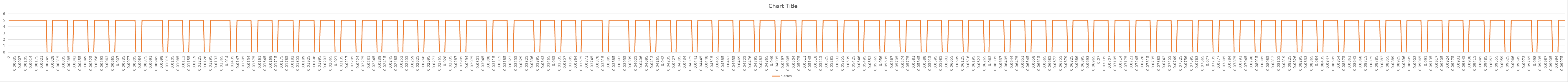
| Category | Series 1 |
|---|---|
| 0.0 | 5 |
| 5e-05 | 5 |
| 0.0001 | 5 |
| 0.00015 | 5 |
| 0.0002 | 5 |
| 0.00025 | 5 |
| 0.0003 | 5 |
| 0.00035 | 5 |
| 0.0004 | 5 |
| 0.00045 | 5 |
| 0.0005 | 5 |
| 0.00055 | 5 |
| 0.0006 | 5 |
| 0.00065 | 5 |
| 0.0007 | 5 |
| 0.00075 | 5 |
| 0.0008 | 5 |
| 0.00085 | 5 |
| 0.0009 | 5 |
| 0.00095 | 5 |
| 0.001 | 5 |
| 0.00105 | 5 |
| 0.0011 | 5 |
| 0.00115 | 5 |
| 0.0012 | 5 |
| 0.00125 | 5 |
| 0.0013 | 5 |
| 0.00135 | 5 |
| 0.0014 | 5 |
| 0.00145 | 5 |
| 0.0015 | 5 |
| 0.00155 | 5 |
| 0.0016 | 5 |
| 0.00165 | 5 |
| 0.0017 | 5 |
| 0.00175 | 5 |
| 0.0018 | 5 |
| 0.00185 | 5 |
| 0.0019 | 5 |
| 0.00195 | 5 |
| 0.002 | 5 |
| 0.00205 | 5 |
| 0.0021 | 5 |
| 0.00215 | 5 |
| 0.0022 | 5 |
| 0.00225 | 5 |
| 0.0023 | 5 |
| 0.00235 | 5 |
| 0.0024 | 5 |
| 0.00245 | 0 |
| 0.0025 | 0 |
| 0.00255 | 0 |
| 0.0026 | 0 |
| 0.00265 | 0 |
| 0.0027 | 0 |
| 0.00275 | 0 |
| 0.0028 | 5 |
| 0.00285 | 5 |
| 0.0029 | 5 |
| 0.00295 | 5 |
| 0.003 | 5 |
| 0.00305 | 5 |
| 0.0031 | 5 |
| 0.00315 | 5 |
| 0.0032 | 5 |
| 0.00325 | 5 |
| 0.0033 | 5 |
| 0.00335 | 5 |
| 0.0034 | 5 |
| 0.00345 | 5 |
| 0.0035 | 5 |
| 0.00355 | 5 |
| 0.0036 | 5 |
| 0.00365 | 5 |
| 0.0037 | 5 |
| 0.00375 | 5 |
| 0.0038 | 0 |
| 0.00385 | 0 |
| 0.0039 | 0 |
| 0.00395 | 0 |
| 0.004 | 0 |
| 0.00405 | 0 |
| 0.0041 | 0 |
| 0.00415 | 5 |
| 0.0042 | 5 |
| 0.00425 | 5 |
| 0.0043 | 5 |
| 0.00435 | 5 |
| 0.0044 | 5 |
| 0.00445 | 5 |
| 0.0045 | 5 |
| 0.00455 | 5 |
| 0.0046 | 5 |
| 0.00465 | 5 |
| 0.0047 | 5 |
| 0.00475 | 5 |
| 0.0048 | 5 |
| 0.00485 | 5 |
| 0.0049 | 5 |
| 0.00495 | 5 |
| 0.005 | 5 |
| 0.00505 | 5 |
| 0.0051 | 0 |
| 0.00515 | 0 |
| 0.0052 | 0 |
| 0.00525 | 0 |
| 0.0053 | 0 |
| 0.00535 | 0 |
| 0.0054 | 0 |
| 0.00545 | 0 |
| 0.0055 | 5 |
| 0.00555 | 5 |
| 0.0056 | 5 |
| 0.00565 | 5 |
| 0.0057 | 5 |
| 0.00575 | 5 |
| 0.0058 | 5 |
| 0.00585 | 5 |
| 0.0059 | 5 |
| 0.00595 | 5 |
| 0.006 | 5 |
| 0.00605 | 5 |
| 0.0061 | 5 |
| 0.00615 | 5 |
| 0.0062 | 5 |
| 0.00625 | 5 |
| 0.0063 | 5 |
| 0.00635 | 5 |
| 0.0064 | 5 |
| 0.00645 | 0 |
| 0.0065 | 0 |
| 0.00655 | 0 |
| 0.0066 | 0 |
| 0.00665 | 0 |
| 0.0067 | 0 |
| 0.00675 | 0 |
| 0.0068 | 0 |
| 0.00685 | 5 |
| 0.0069 | 5 |
| 0.00695 | 5 |
| 0.007 | 5 |
| 0.00705 | 5 |
| 0.0071 | 5 |
| 0.00715 | 5 |
| 0.0072 | 5 |
| 0.00725 | 5 |
| 0.0073 | 5 |
| 0.00735 | 5 |
| 0.0074 | 5 |
| 0.00745 | 5 |
| 0.0075 | 5 |
| 0.00755 | 5 |
| 0.0076 | 5 |
| 0.00765 | 5 |
| 0.0077 | 5 |
| 0.00775 | 5 |
| 0.0078 | 5 |
| 0.00785 | 5 |
| 0.0079 | 5 |
| 0.00795 | 5 |
| 0.008 | 5 |
| 0.00805 | 5 |
| 0.0081 | 5 |
| 0.00815 | 0 |
| 0.0082 | 0 |
| 0.00825 | 0 |
| 0.0083 | 0 |
| 0.00835 | 0 |
| 0.0084 | 0 |
| 0.00845 | 0 |
| 0.0085 | 0 |
| 0.00855 | 5 |
| 0.0086 | 5 |
| 0.00865 | 5 |
| 0.0087 | 5 |
| 0.00875 | 5 |
| 0.0088 | 5 |
| 0.00885 | 5 |
| 0.0089 | 5 |
| 0.00895 | 5 |
| 0.009 | 5 |
| 0.00905 | 5 |
| 0.0091 | 5 |
| 0.00915 | 5 |
| 0.0092 | 5 |
| 0.00925 | 5 |
| 0.0093 | 5 |
| 0.00935 | 5 |
| 0.0094 | 5 |
| 0.00945 | 5 |
| 0.0095 | 5 |
| 0.00955 | 5 |
| 0.0096 | 5 |
| 0.00965 | 5 |
| 0.0097 | 5 |
| 0.00975 | 5 |
| 0.0098 | 5 |
| 0.00985 | 5 |
| 0.0099 | 0 |
| 0.00995 | 0 |
| 0.01 | 0 |
| 0.01005 | 0 |
| 0.0101 | 0 |
| 0.01015 | 0 |
| 0.0102 | 0 |
| 0.01025 | 5 |
| 0.0103 | 5 |
| 0.01035 | 5 |
| 0.0104 | 5 |
| 0.01045 | 5 |
| 0.0105 | 5 |
| 0.01055 | 5 |
| 0.0106 | 5 |
| 0.01065 | 5 |
| 0.0107 | 5 |
| 0.01075 | 5 |
| 0.0108 | 5 |
| 0.01085 | 5 |
| 0.0109 | 5 |
| 0.01095 | 5 |
| 0.011 | 5 |
| 0.01105 | 5 |
| 0.0111 | 5 |
| 0.01115 | 5 |
| 0.0112 | 0 |
| 0.01125 | 0 |
| 0.0113 | 0 |
| 0.01135 | 0 |
| 0.0114 | 0 |
| 0.01145 | 0 |
| 0.0115 | 0 |
| 0.01155 | 0 |
| 0.0116 | 5 |
| 0.01165 | 5 |
| 0.0117 | 5 |
| 0.01175 | 5 |
| 0.0118 | 5 |
| 0.01185 | 5 |
| 0.0119 | 5 |
| 0.01195 | 5 |
| 0.012 | 5 |
| 0.01205 | 5 |
| 0.0121 | 5 |
| 0.01215 | 5 |
| 0.0122 | 5 |
| 0.01225 | 5 |
| 0.0123 | 5 |
| 0.01235 | 5 |
| 0.0124 | 5 |
| 0.01245 | 5 |
| 0.0125 | 5 |
| 0.01255 | 0 |
| 0.0126 | 0 |
| 0.01265 | 0 |
| 0.0127 | 0 |
| 0.01275 | 0 |
| 0.0128 | 0 |
| 0.01285 | 0 |
| 0.0129 | 0 |
| 0.01295 | 5 |
| 0.013 | 5 |
| 0.01305 | 5 |
| 0.0131 | 5 |
| 0.01315 | 5 |
| 0.0132 | 5 |
| 0.01325 | 5 |
| 0.0133 | 5 |
| 0.01335 | 5 |
| 0.0134 | 5 |
| 0.01345 | 5 |
| 0.0135 | 5 |
| 0.01355 | 5 |
| 0.0136 | 5 |
| 0.01365 | 5 |
| 0.0137 | 5 |
| 0.01375 | 5 |
| 0.0138 | 5 |
| 0.01385 | 5 |
| 0.0139 | 5 |
| 0.01395 | 5 |
| 0.014 | 5 |
| 0.01405 | 5 |
| 0.0141 | 5 |
| 0.01415 | 5 |
| 0.0142 | 5 |
| 0.01425 | 0 |
| 0.0143 | 0 |
| 0.01435 | 0 |
| 0.0144 | 0 |
| 0.01445 | 0 |
| 0.0145 | 0 |
| 0.01455 | 0 |
| 0.0146 | 0 |
| 0.01465 | 5 |
| 0.0147 | 5 |
| 0.01475 | 5 |
| 0.0148 | 5 |
| 0.01485 | 5 |
| 0.0149 | 5 |
| 0.01495 | 5 |
| 0.015 | 5 |
| 0.01505 | 5 |
| 0.0151 | 5 |
| 0.01515 | 5 |
| 0.0152 | 5 |
| 0.01525 | 5 |
| 0.0153 | 5 |
| 0.01535 | 5 |
| 0.0154 | 5 |
| 0.01545 | 5 |
| 0.0155 | 5 |
| 0.01555 | 5 |
| 0.0156 | 0 |
| 0.01565 | 0 |
| 0.0157 | 0 |
| 0.01575 | 0 |
| 0.0158 | 0 |
| 0.01585 | 0 |
| 0.0159 | 0 |
| 0.01595 | 0 |
| 0.016 | 5 |
| 0.01605 | 5 |
| 0.0161 | 5 |
| 0.01615 | 5 |
| 0.0162 | 5 |
| 0.01625 | 5 |
| 0.0163 | 5 |
| 0.01635 | 5 |
| 0.0164 | 5 |
| 0.01645 | 5 |
| 0.0165 | 5 |
| 0.01655 | 5 |
| 0.0166 | 5 |
| 0.01665 | 5 |
| 0.0167 | 5 |
| 0.01675 | 5 |
| 0.0168 | 5 |
| 0.01685 | 5 |
| 0.0169 | 5 |
| 0.01695 | 0 |
| 0.017 | 0 |
| 0.01705 | 0 |
| 0.0171 | 0 |
| 0.01715 | 0 |
| 0.0172 | 0 |
| 0.01725 | 0 |
| 0.0173 | 5 |
| 0.01735 | 5 |
| 0.0174 | 5 |
| 0.01745 | 5 |
| 0.0175 | 5 |
| 0.01755 | 5 |
| 0.0176 | 5 |
| 0.01765 | 5 |
| 0.0177 | 5 |
| 0.01775 | 5 |
| 0.0178 | 5 |
| 0.01785 | 5 |
| 0.0179 | 5 |
| 0.01795 | 5 |
| 0.018 | 5 |
| 0.01805 | 5 |
| 0.0181 | 5 |
| 0.01815 | 5 |
| 0.0182 | 5 |
| 0.01825 | 5 |
| 0.0183 | 0 |
| 0.01835 | 0 |
| 0.0184 | 0 |
| 0.01845 | 0 |
| 0.0185 | 0 |
| 0.01855 | 0 |
| 0.0186 | 0 |
| 0.01865 | 5 |
| 0.0187 | 5 |
| 0.01875 | 5 |
| 0.0188 | 5 |
| 0.01885 | 5 |
| 0.0189 | 5 |
| 0.01895 | 5 |
| 0.019 | 5 |
| 0.01905 | 5 |
| 0.0191 | 5 |
| 0.01915 | 5 |
| 0.0192 | 5 |
| 0.01925 | 5 |
| 0.0193 | 5 |
| 0.01935 | 5 |
| 0.0194 | 5 |
| 0.01945 | 5 |
| 0.0195 | 5 |
| 0.01955 | 5 |
| 0.0196 | 5 |
| 0.01965 | 0 |
| 0.0197 | 0 |
| 0.01975 | 0 |
| 0.0198 | 0 |
| 0.01985 | 0 |
| 0.0199 | 0 |
| 0.01995 | 0 |
| 0.02 | 5 |
| 0.02005 | 5 |
| 0.0201 | 5 |
| 0.02015 | 5 |
| 0.0202 | 5 |
| 0.02025 | 5 |
| 0.0203 | 5 |
| 0.02035 | 5 |
| 0.0204 | 5 |
| 0.02045 | 5 |
| 0.0205 | 5 |
| 0.02055 | 5 |
| 0.0206 | 5 |
| 0.02065 | 5 |
| 0.0207 | 5 |
| 0.02075 | 5 |
| 0.0208 | 5 |
| 0.02085 | 5 |
| 0.0209 | 5 |
| 0.02095 | 0 |
| 0.021 | 0 |
| 0.02105 | 0 |
| 0.0211 | 0 |
| 0.02115 | 0 |
| 0.0212 | 0 |
| 0.02125 | 0 |
| 0.0213 | 0 |
| 0.02135 | 5 |
| 0.0214 | 5 |
| 0.02145 | 5 |
| 0.0215 | 5 |
| 0.02155 | 5 |
| 0.0216 | 5 |
| 0.02165 | 5 |
| 0.0217 | 5 |
| 0.02175 | 5 |
| 0.0218 | 5 |
| 0.02185 | 5 |
| 0.0219 | 5 |
| 0.02195 | 5 |
| 0.022 | 5 |
| 0.02205 | 5 |
| 0.0221 | 5 |
| 0.02215 | 5 |
| 0.0222 | 5 |
| 0.02225 | 5 |
| 0.0223 | 0 |
| 0.02235 | 0 |
| 0.0224 | 0 |
| 0.02245 | 0 |
| 0.0225 | 0 |
| 0.02255 | 0 |
| 0.0226 | 0 |
| 0.02265 | 0 |
| 0.0227 | 5 |
| 0.02275 | 5 |
| 0.0228 | 5 |
| 0.02285 | 5 |
| 0.0229 | 5 |
| 0.02295 | 5 |
| 0.023 | 5 |
| 0.02305 | 5 |
| 0.0231 | 5 |
| 0.02315 | 5 |
| 0.0232 | 5 |
| 0.02325 | 5 |
| 0.0233 | 5 |
| 0.02335 | 5 |
| 0.0234 | 5 |
| 0.02345 | 5 |
| 0.0235 | 5 |
| 0.02355 | 5 |
| 0.0236 | 5 |
| 0.02365 | 0 |
| 0.0237 | 0 |
| 0.02375 | 0 |
| 0.0238 | 0 |
| 0.02385 | 0 |
| 0.0239 | 0 |
| 0.02395 | 0 |
| 0.024 | 5 |
| 0.02405 | 5 |
| 0.0241 | 5 |
| 0.02415 | 5 |
| 0.0242 | 5 |
| 0.02425 | 5 |
| 0.0243 | 5 |
| 0.02435 | 5 |
| 0.0244 | 5 |
| 0.02445 | 5 |
| 0.0245 | 5 |
| 0.02455 | 5 |
| 0.0246 | 5 |
| 0.02465 | 5 |
| 0.0247 | 5 |
| 0.02475 | 5 |
| 0.0248 | 5 |
| 0.02485 | 5 |
| 0.0249 | 5 |
| 0.02495 | 5 |
| 0.025 | 0 |
| 0.02505 | 0 |
| 0.0251 | 0 |
| 0.02515 | 0 |
| 0.0252 | 0 |
| 0.02525 | 0 |
| 0.0253 | 0 |
| 0.02535 | 5 |
| 0.0254 | 5 |
| 0.02545 | 5 |
| 0.0255 | 5 |
| 0.02555 | 5 |
| 0.0256 | 5 |
| 0.02565 | 5 |
| 0.0257 | 5 |
| 0.02575 | 5 |
| 0.0258 | 5 |
| 0.02585 | 5 |
| 0.0259 | 5 |
| 0.02595 | 5 |
| 0.026 | 5 |
| 0.02605 | 5 |
| 0.0261 | 5 |
| 0.02615 | 5 |
| 0.0262 | 5 |
| 0.02625 | 5 |
| 0.0263 | 0 |
| 0.02635 | 0 |
| 0.0264 | 0 |
| 0.02645 | 0 |
| 0.0265 | 0 |
| 0.02655 | 0 |
| 0.0266 | 0 |
| 0.02665 | 0 |
| 0.0267 | 5 |
| 0.02675 | 5 |
| 0.0268 | 5 |
| 0.02685 | 5 |
| 0.0269 | 5 |
| 0.02695 | 5 |
| 0.027 | 5 |
| 0.02705 | 5 |
| 0.0271 | 5 |
| 0.02715 | 5 |
| 0.0272 | 5 |
| 0.02725 | 5 |
| 0.0273 | 5 |
| 0.02735 | 5 |
| 0.0274 | 5 |
| 0.02745 | 5 |
| 0.0275 | 5 |
| 0.02755 | 5 |
| 0.0276 | 5 |
| 0.02765 | 0 |
| 0.0277 | 0 |
| 0.02775 | 0 |
| 0.0278 | 0 |
| 0.02785 | 0 |
| 0.0279 | 0 |
| 0.02795 | 0 |
| 0.028 | 0 |
| 0.02805 | 5 |
| 0.0281 | 5 |
| 0.02815 | 5 |
| 0.0282 | 5 |
| 0.02825 | 5 |
| 0.0283 | 5 |
| 0.02835 | 5 |
| 0.0284 | 5 |
| 0.02845 | 5 |
| 0.0285 | 5 |
| 0.02855 | 5 |
| 0.0286 | 5 |
| 0.02865 | 5 |
| 0.0287 | 5 |
| 0.02875 | 5 |
| 0.0288 | 5 |
| 0.02885 | 5 |
| 0.0289 | 5 |
| 0.02895 | 5 |
| 0.029 | 0 |
| 0.02905 | 0 |
| 0.0291 | 0 |
| 0.02915 | 0 |
| 0.0292 | 0 |
| 0.02925 | 0 |
| 0.0293 | 0 |
| 0.02935 | 0 |
| 0.0294 | 5 |
| 0.02945 | 5 |
| 0.0295 | 5 |
| 0.02955 | 5 |
| 0.0296 | 5 |
| 0.02965 | 5 |
| 0.0297 | 5 |
| 0.02975 | 5 |
| 0.0298 | 5 |
| 0.02985 | 5 |
| 0.0299 | 5 |
| 0.02995 | 5 |
| 0.03 | 5 |
| 0.03005 | 5 |
| 0.0301 | 5 |
| 0.03015 | 5 |
| 0.0302 | 5 |
| 0.03025 | 5 |
| 0.0303 | 5 |
| 0.03035 | 5 |
| 0.0304 | 5 |
| 0.03045 | 5 |
| 0.0305 | 5 |
| 0.03055 | 5 |
| 0.0306 | 5 |
| 0.03065 | 5 |
| 0.0307 | 0 |
| 0.03075 | 0 |
| 0.0308 | 0 |
| 0.03085 | 0 |
| 0.0309 | 0 |
| 0.03095 | 0 |
| 0.031 | 0 |
| 0.03105 | 0 |
| 0.0311 | 5 |
| 0.03115 | 5 |
| 0.0312 | 5 |
| 0.03125 | 5 |
| 0.0313 | 5 |
| 0.03135 | 5 |
| 0.0314 | 5 |
| 0.03145 | 5 |
| 0.0315 | 5 |
| 0.03155 | 5 |
| 0.0316 | 5 |
| 0.03165 | 5 |
| 0.0317 | 5 |
| 0.03175 | 5 |
| 0.0318 | 5 |
| 0.03185 | 5 |
| 0.0319 | 5 |
| 0.03195 | 5 |
| 0.032 | 5 |
| 0.03205 | 0 |
| 0.0321 | 0 |
| 0.03215 | 0 |
| 0.0322 | 0 |
| 0.03225 | 0 |
| 0.0323 | 0 |
| 0.03235 | 0 |
| 0.0324 | 0 |
| 0.03245 | 5 |
| 0.0325 | 5 |
| 0.03255 | 5 |
| 0.0326 | 5 |
| 0.03265 | 5 |
| 0.0327 | 5 |
| 0.03275 | 5 |
| 0.0328 | 5 |
| 0.03285 | 5 |
| 0.0329 | 5 |
| 0.03295 | 5 |
| 0.033 | 5 |
| 0.03305 | 5 |
| 0.0331 | 5 |
| 0.03315 | 5 |
| 0.0332 | 5 |
| 0.03325 | 5 |
| 0.0333 | 5 |
| 0.03335 | 5 |
| 0.0334 | 5 |
| 0.03345 | 5 |
| 0.0335 | 5 |
| 0.03355 | 5 |
| 0.0336 | 5 |
| 0.03365 | 5 |
| 0.0337 | 5 |
| 0.03375 | 0 |
| 0.0338 | 0 |
| 0.03385 | 0 |
| 0.0339 | 0 |
| 0.03395 | 0 |
| 0.034 | 0 |
| 0.03405 | 0 |
| 0.0341 | 0 |
| 0.03415 | 5 |
| 0.0342 | 5 |
| 0.03425 | 5 |
| 0.0343 | 5 |
| 0.03435 | 5 |
| 0.0344 | 5 |
| 0.03445 | 5 |
| 0.0345 | 5 |
| 0.03455 | 5 |
| 0.0346 | 5 |
| 0.03465 | 5 |
| 0.0347 | 5 |
| 0.03475 | 5 |
| 0.0348 | 5 |
| 0.03485 | 5 |
| 0.0349 | 5 |
| 0.03495 | 5 |
| 0.035 | 5 |
| 0.03505 | 5 |
| 0.0351 | 0 |
| 0.03515 | 0 |
| 0.0352 | 0 |
| 0.03525 | 0 |
| 0.0353 | 0 |
| 0.03535 | 0 |
| 0.0354 | 0 |
| 0.03545 | 0 |
| 0.0355 | 5 |
| 0.03555 | 5 |
| 0.0356 | 5 |
| 0.03565 | 5 |
| 0.0357 | 5 |
| 0.03575 | 5 |
| 0.0358 | 5 |
| 0.03585 | 5 |
| 0.0359 | 5 |
| 0.03595 | 5 |
| 0.036 | 5 |
| 0.03605 | 5 |
| 0.0361 | 5 |
| 0.03615 | 5 |
| 0.0362 | 5 |
| 0.03625 | 5 |
| 0.0363 | 5 |
| 0.03635 | 5 |
| 0.0364 | 5 |
| 0.03645 | 0 |
| 0.0365 | 0 |
| 0.03655 | 0 |
| 0.0366 | 0 |
| 0.03665 | 0 |
| 0.0367 | 0 |
| 0.03675 | 0 |
| 0.0368 | 5 |
| 0.03685 | 5 |
| 0.0369 | 5 |
| 0.03695 | 5 |
| 0.037 | 5 |
| 0.03705 | 5 |
| 0.0371 | 5 |
| 0.03715 | 5 |
| 0.0372 | 5 |
| 0.03725 | 5 |
| 0.0373 | 5 |
| 0.03735 | 5 |
| 0.0374 | 5 |
| 0.03745 | 5 |
| 0.0375 | 5 |
| 0.03755 | 5 |
| 0.0376 | 5 |
| 0.03765 | 5 |
| 0.0377 | 5 |
| 0.03775 | 5 |
| 0.0378 | 5 |
| 0.03785 | 5 |
| 0.0379 | 5 |
| 0.03795 | 5 |
| 0.038 | 5 |
| 0.03805 | 5 |
| 0.0381 | 5 |
| 0.03815 | 0 |
| 0.0382 | 0 |
| 0.03825 | 0 |
| 0.0383 | 0 |
| 0.03835 | 0 |
| 0.0384 | 0 |
| 0.03845 | 0 |
| 0.0385 | 0 |
| 0.03855 | 5 |
| 0.0386 | 5 |
| 0.03865 | 5 |
| 0.0387 | 5 |
| 0.03875 | 5 |
| 0.0388 | 5 |
| 0.03885 | 5 |
| 0.0389 | 5 |
| 0.03895 | 5 |
| 0.039 | 5 |
| 0.03905 | 5 |
| 0.0391 | 5 |
| 0.03915 | 5 |
| 0.0392 | 5 |
| 0.03925 | 5 |
| 0.0393 | 5 |
| 0.03935 | 5 |
| 0.0394 | 5 |
| 0.03945 | 5 |
| 0.0395 | 5 |
| 0.03955 | 5 |
| 0.0396 | 5 |
| 0.03965 | 5 |
| 0.0397 | 5 |
| 0.03975 | 5 |
| 0.0398 | 5 |
| 0.03985 | 0 |
| 0.0399 | 0 |
| 0.03995 | 0 |
| 0.04 | 0 |
| 0.04005 | 0 |
| 0.0401 | 0 |
| 0.04015 | 0 |
| 0.0402 | 0 |
| 0.04025 | 5 |
| 0.0403 | 5 |
| 0.04035 | 5 |
| 0.0404 | 5 |
| 0.04045 | 5 |
| 0.0405 | 5 |
| 0.04055 | 5 |
| 0.0406 | 5 |
| 0.04065 | 5 |
| 0.0407 | 5 |
| 0.04075 | 5 |
| 0.0408 | 5 |
| 0.04085 | 5 |
| 0.0409 | 5 |
| 0.04095 | 5 |
| 0.041 | 5 |
| 0.04105 | 5 |
| 0.0411 | 5 |
| 0.04115 | 5 |
| 0.0412 | 0 |
| 0.04125 | 0 |
| 0.0413 | 0 |
| 0.04135 | 0 |
| 0.0414 | 0 |
| 0.04145 | 0 |
| 0.0415 | 0 |
| 0.04155 | 0 |
| 0.0416 | 5 |
| 0.04165 | 5 |
| 0.0417 | 5 |
| 0.04175 | 5 |
| 0.0418 | 5 |
| 0.04185 | 5 |
| 0.0419 | 5 |
| 0.04195 | 5 |
| 0.042 | 5 |
| 0.04205 | 5 |
| 0.0421 | 5 |
| 0.04215 | 5 |
| 0.0422 | 5 |
| 0.04225 | 5 |
| 0.0423 | 5 |
| 0.04235 | 5 |
| 0.0424 | 5 |
| 0.04245 | 5 |
| 0.0425 | 5 |
| 0.04255 | 0 |
| 0.0426 | 0 |
| 0.04265 | 0 |
| 0.0427 | 0 |
| 0.04275 | 0 |
| 0.0428 | 0 |
| 0.04285 | 0 |
| 0.0429 | 5 |
| 0.04295 | 5 |
| 0.043 | 5 |
| 0.04305 | 5 |
| 0.0431 | 5 |
| 0.04315 | 5 |
| 0.0432 | 5 |
| 0.04325 | 5 |
| 0.0433 | 5 |
| 0.04335 | 5 |
| 0.0434 | 5 |
| 0.04345 | 5 |
| 0.0435 | 5 |
| 0.04355 | 5 |
| 0.0436 | 5 |
| 0.04365 | 5 |
| 0.0437 | 5 |
| 0.04375 | 5 |
| 0.0438 | 5 |
| 0.04385 | 5 |
| 0.0439 | 0 |
| 0.04395 | 0 |
| 0.044 | 0 |
| 0.04405 | 0 |
| 0.0441 | 0 |
| 0.04415 | 0 |
| 0.0442 | 0 |
| 0.04425 | 5 |
| 0.0443 | 5 |
| 0.04435 | 5 |
| 0.0444 | 5 |
| 0.04445 | 5 |
| 0.0445 | 5 |
| 0.04455 | 5 |
| 0.0446 | 5 |
| 0.04465 | 5 |
| 0.0447 | 5 |
| 0.04475 | 5 |
| 0.0448 | 5 |
| 0.04485 | 5 |
| 0.0449 | 5 |
| 0.04495 | 5 |
| 0.045 | 5 |
| 0.04505 | 5 |
| 0.0451 | 5 |
| 0.04515 | 5 |
| 0.0452 | 0 |
| 0.04525 | 0 |
| 0.0453 | 0 |
| 0.04535 | 0 |
| 0.0454 | 0 |
| 0.04545 | 0 |
| 0.0455 | 0 |
| 0.04555 | 0 |
| 0.0456 | 5 |
| 0.04565 | 5 |
| 0.0457 | 5 |
| 0.04575 | 5 |
| 0.0458 | 5 |
| 0.04585 | 5 |
| 0.0459 | 5 |
| 0.04595 | 5 |
| 0.046 | 5 |
| 0.04605 | 5 |
| 0.0461 | 5 |
| 0.04615 | 5 |
| 0.0462 | 5 |
| 0.04625 | 5 |
| 0.0463 | 5 |
| 0.04635 | 5 |
| 0.0464 | 5 |
| 0.04645 | 5 |
| 0.0465 | 5 |
| 0.04655 | 0 |
| 0.0466 | 0 |
| 0.04665 | 0 |
| 0.0467 | 0 |
| 0.04675 | 0 |
| 0.0468 | 0 |
| 0.04685 | 0 |
| 0.0469 | 0 |
| 0.04695 | 5 |
| 0.047 | 5 |
| 0.04705 | 5 |
| 0.0471 | 5 |
| 0.04715 | 5 |
| 0.0472 | 5 |
| 0.04725 | 5 |
| 0.0473 | 5 |
| 0.04735 | 5 |
| 0.0474 | 5 |
| 0.04745 | 5 |
| 0.0475 | 5 |
| 0.04755 | 5 |
| 0.0476 | 5 |
| 0.04765 | 5 |
| 0.0477 | 5 |
| 0.04775 | 5 |
| 0.0478 | 5 |
| 0.04785 | 5 |
| 0.0479 | 0 |
| 0.04795 | 0 |
| 0.048 | 0 |
| 0.04805 | 0 |
| 0.0481 | 0 |
| 0.04815 | 0 |
| 0.0482 | 0 |
| 0.04825 | 5 |
| 0.0483 | 5 |
| 0.04835 | 5 |
| 0.0484 | 5 |
| 0.04845 | 5 |
| 0.0485 | 5 |
| 0.04855 | 5 |
| 0.0486 | 5 |
| 0.04865 | 5 |
| 0.0487 | 5 |
| 0.04875 | 5 |
| 0.0488 | 5 |
| 0.04885 | 5 |
| 0.0489 | 5 |
| 0.04895 | 5 |
| 0.049 | 5 |
| 0.04905 | 5 |
| 0.0491 | 5 |
| 0.04915 | 5 |
| 0.0492 | 5 |
| 0.04925 | 0 |
| 0.0493 | 0 |
| 0.04935 | 0 |
| 0.0494 | 0 |
| 0.04945 | 0 |
| 0.0495 | 0 |
| 0.04955 | 0 |
| 0.0496 | 5 |
| 0.04965 | 5 |
| 0.0497 | 5 |
| 0.04975 | 5 |
| 0.0498 | 5 |
| 0.04985 | 5 |
| 0.0499 | 5 |
| 0.04995 | 5 |
| 0.05 | 5 |
| 0.05005 | 5 |
| 0.0501 | 5 |
| 0.05015 | 5 |
| 0.0502 | 5 |
| 0.05025 | 5 |
| 0.0503 | 5 |
| 0.05035 | 5 |
| 0.0504 | 5 |
| 0.05045 | 5 |
| 0.0505 | 5 |
| 0.05055 | 5 |
| 0.0506 | 0 |
| 0.05065 | 0 |
| 0.0507 | 0 |
| 0.05075 | 0 |
| 0.0508 | 0 |
| 0.05085 | 0 |
| 0.0509 | 0 |
| 0.05095 | 5 |
| 0.051 | 5 |
| 0.05105 | 5 |
| 0.0511 | 5 |
| 0.05115 | 5 |
| 0.0512 | 5 |
| 0.05125 | 5 |
| 0.0513 | 5 |
| 0.05135 | 5 |
| 0.0514 | 5 |
| 0.05145 | 5 |
| 0.0515 | 5 |
| 0.05155 | 5 |
| 0.0516 | 5 |
| 0.05165 | 5 |
| 0.0517 | 5 |
| 0.05175 | 5 |
| 0.0518 | 5 |
| 0.05185 | 5 |
| 0.0519 | 0 |
| 0.05195 | 0 |
| 0.052 | 0 |
| 0.05205 | 0 |
| 0.0521 | 0 |
| 0.05215 | 0 |
| 0.0522 | 0 |
| 0.05225 | 0 |
| 0.0523 | 5 |
| 0.05235 | 5 |
| 0.0524 | 5 |
| 0.05245 | 5 |
| 0.0525 | 5 |
| 0.05255 | 5 |
| 0.0526 | 5 |
| 0.05265 | 5 |
| 0.0527 | 5 |
| 0.05275 | 5 |
| 0.0528 | 5 |
| 0.05285 | 5 |
| 0.0529 | 5 |
| 0.05295 | 5 |
| 0.053 | 5 |
| 0.05305 | 5 |
| 0.0531 | 5 |
| 0.05315 | 5 |
| 0.0532 | 5 |
| 0.05325 | 0 |
| 0.0533 | 0 |
| 0.05335 | 0 |
| 0.0534 | 0 |
| 0.05345 | 0 |
| 0.0535 | 0 |
| 0.05355 | 0 |
| 0.0536 | 0 |
| 0.05365 | 5 |
| 0.0537 | 5 |
| 0.05375 | 5 |
| 0.0538 | 5 |
| 0.05385 | 5 |
| 0.0539 | 5 |
| 0.05395 | 5 |
| 0.054 | 5 |
| 0.05405 | 5 |
| 0.0541 | 5 |
| 0.05415 | 5 |
| 0.0542 | 5 |
| 0.05425 | 5 |
| 0.0543 | 5 |
| 0.05435 | 5 |
| 0.0544 | 5 |
| 0.05445 | 5 |
| 0.0545 | 5 |
| 0.05455 | 5 |
| 0.0546 | 0 |
| 0.05465 | 0 |
| 0.0547 | 0 |
| 0.05475 | 0 |
| 0.0548 | 0 |
| 0.05485 | 0 |
| 0.0549 | 0 |
| 0.05495 | 5 |
| 0.055 | 5 |
| 0.05505 | 5 |
| 0.0551 | 5 |
| 0.05515 | 5 |
| 0.0552 | 5 |
| 0.05525 | 5 |
| 0.0553 | 5 |
| 0.05535 | 5 |
| 0.0554 | 5 |
| 0.05545 | 5 |
| 0.0555 | 5 |
| 0.05555 | 5 |
| 0.0556 | 5 |
| 0.05565 | 5 |
| 0.0557 | 5 |
| 0.05575 | 5 |
| 0.0558 | 5 |
| 0.05585 | 5 |
| 0.0559 | 5 |
| 0.05595 | 0 |
| 0.056 | 0 |
| 0.05605 | 0 |
| 0.0561 | 0 |
| 0.05615 | 0 |
| 0.0562 | 0 |
| 0.05625 | 0 |
| 0.0563 | 5 |
| 0.05635 | 5 |
| 0.0564 | 5 |
| 0.05645 | 5 |
| 0.0565 | 5 |
| 0.05655 | 5 |
| 0.0566 | 5 |
| 0.05665 | 5 |
| 0.0567 | 5 |
| 0.05675 | 5 |
| 0.0568 | 5 |
| 0.05685 | 5 |
| 0.0569 | 5 |
| 0.05695 | 5 |
| 0.057 | 5 |
| 0.05705 | 5 |
| 0.0571 | 5 |
| 0.05715 | 5 |
| 0.0572 | 5 |
| 0.05725 | 0 |
| 0.0573 | 0 |
| 0.05735 | 0 |
| 0.0574 | 0 |
| 0.05745 | 0 |
| 0.0575 | 0 |
| 0.05755 | 0 |
| 0.0576 | 0 |
| 0.05765 | 5 |
| 0.0577 | 5 |
| 0.05775 | 5 |
| 0.0578 | 5 |
| 0.05785 | 5 |
| 0.0579 | 5 |
| 0.05795 | 5 |
| 0.058 | 5 |
| 0.05805 | 5 |
| 0.0581 | 5 |
| 0.05815 | 5 |
| 0.0582 | 5 |
| 0.05825 | 5 |
| 0.0583 | 5 |
| 0.05835 | 5 |
| 0.0584 | 5 |
| 0.05845 | 5 |
| 0.0585 | 5 |
| 0.05855 | 5 |
| 0.0586 | 0 |
| 0.05865 | 0 |
| 0.0587 | 0 |
| 0.05875 | 0 |
| 0.0588 | 0 |
| 0.05885 | 0 |
| 0.0589 | 0 |
| 0.05895 | 0 |
| 0.059 | 5 |
| 0.05905 | 5 |
| 0.0591 | 5 |
| 0.05915 | 5 |
| 0.0592 | 5 |
| 0.05925 | 5 |
| 0.0593 | 5 |
| 0.05935 | 5 |
| 0.0594 | 5 |
| 0.05945 | 5 |
| 0.0595 | 5 |
| 0.05955 | 5 |
| 0.0596 | 5 |
| 0.05965 | 5 |
| 0.0597 | 5 |
| 0.05975 | 5 |
| 0.0598 | 5 |
| 0.05985 | 5 |
| 0.0599 | 5 |
| 0.05995 | 0 |
| 0.06 | 0 |
| 0.06005 | 0 |
| 0.0601 | 0 |
| 0.06015 | 0 |
| 0.0602 | 0 |
| 0.06025 | 0 |
| 0.0603 | 0 |
| 0.06035 | 5 |
| 0.0604 | 5 |
| 0.06045 | 5 |
| 0.0605 | 5 |
| 0.06055 | 5 |
| 0.0606 | 5 |
| 0.06065 | 5 |
| 0.0607 | 5 |
| 0.06075 | 5 |
| 0.0608 | 5 |
| 0.06085 | 5 |
| 0.0609 | 5 |
| 0.06095 | 5 |
| 0.061 | 5 |
| 0.06105 | 5 |
| 0.0611 | 5 |
| 0.06115 | 5 |
| 0.0612 | 5 |
| 0.06125 | 5 |
| 0.0613 | 0 |
| 0.06135 | 0 |
| 0.0614 | 0 |
| 0.06145 | 0 |
| 0.0615 | 0 |
| 0.06155 | 0 |
| 0.0616 | 0 |
| 0.06165 | 5 |
| 0.0617 | 5 |
| 0.06175 | 5 |
| 0.0618 | 5 |
| 0.06185 | 5 |
| 0.0619 | 5 |
| 0.06195 | 5 |
| 0.062 | 5 |
| 0.06205 | 5 |
| 0.0621 | 5 |
| 0.06215 | 5 |
| 0.0622 | 5 |
| 0.06225 | 5 |
| 0.0623 | 5 |
| 0.06235 | 5 |
| 0.0624 | 5 |
| 0.06245 | 5 |
| 0.0625 | 5 |
| 0.06255 | 5 |
| 0.0626 | 5 |
| 0.06265 | 0 |
| 0.0627 | 0 |
| 0.06275 | 0 |
| 0.0628 | 0 |
| 0.06285 | 0 |
| 0.0629 | 0 |
| 0.06295 | 0 |
| 0.063 | 5 |
| 0.06305 | 5 |
| 0.0631 | 5 |
| 0.06315 | 5 |
| 0.0632 | 5 |
| 0.06325 | 5 |
| 0.0633 | 5 |
| 0.06335 | 5 |
| 0.0634 | 5 |
| 0.06345 | 5 |
| 0.0635 | 5 |
| 0.06355 | 5 |
| 0.0636 | 5 |
| 0.06365 | 5 |
| 0.0637 | 5 |
| 0.06375 | 5 |
| 0.0638 | 5 |
| 0.06385 | 5 |
| 0.0639 | 5 |
| 0.06395 | 0 |
| 0.064 | 0 |
| 0.06405 | 0 |
| 0.0641 | 0 |
| 0.06415 | 0 |
| 0.0642 | 0 |
| 0.06425 | 0 |
| 0.0643 | 0 |
| 0.06435 | 5 |
| 0.0644 | 5 |
| 0.06445 | 5 |
| 0.0645 | 5 |
| 0.06455 | 5 |
| 0.0646 | 5 |
| 0.06465 | 5 |
| 0.0647 | 5 |
| 0.06475 | 5 |
| 0.0648 | 5 |
| 0.06485 | 5 |
| 0.0649 | 5 |
| 0.06495 | 5 |
| 0.065 | 5 |
| 0.06505 | 5 |
| 0.0651 | 5 |
| 0.06515 | 5 |
| 0.0652 | 5 |
| 0.06525 | 5 |
| 0.0653 | 0 |
| 0.06535 | 0 |
| 0.0654 | 0 |
| 0.06545 | 0 |
| 0.0655 | 0 |
| 0.06555 | 0 |
| 0.0656 | 0 |
| 0.06565 | 0 |
| 0.0657 | 5 |
| 0.06575 | 5 |
| 0.0658 | 5 |
| 0.06585 | 5 |
| 0.0659 | 5 |
| 0.06595 | 5 |
| 0.066 | 5 |
| 0.06605 | 5 |
| 0.0661 | 5 |
| 0.06615 | 5 |
| 0.0662 | 5 |
| 0.06625 | 5 |
| 0.0663 | 5 |
| 0.06635 | 5 |
| 0.0664 | 5 |
| 0.06645 | 5 |
| 0.0665 | 5 |
| 0.06655 | 5 |
| 0.0666 | 5 |
| 0.06665 | 0 |
| 0.0667 | 0 |
| 0.06675 | 0 |
| 0.0668 | 0 |
| 0.06685 | 0 |
| 0.0669 | 0 |
| 0.06695 | 0 |
| 0.067 | 0 |
| 0.06705 | 5 |
| 0.0671 | 5 |
| 0.06715 | 5 |
| 0.0672 | 5 |
| 0.06725 | 5 |
| 0.0673 | 5 |
| 0.06735 | 5 |
| 0.0674 | 5 |
| 0.06745 | 5 |
| 0.0675 | 5 |
| 0.06755 | 5 |
| 0.0676 | 5 |
| 0.06765 | 5 |
| 0.0677 | 5 |
| 0.06775 | 5 |
| 0.0678 | 5 |
| 0.06785 | 5 |
| 0.0679 | 5 |
| 0.06795 | 5 |
| 0.068 | 0 |
| 0.06805 | 0 |
| 0.0681 | 0 |
| 0.06815 | 0 |
| 0.0682 | 0 |
| 0.06825 | 0 |
| 0.0683 | 0 |
| 0.06835 | 5 |
| 0.0684 | 5 |
| 0.06845 | 5 |
| 0.0685 | 5 |
| 0.06855 | 5 |
| 0.0686 | 5 |
| 0.06865 | 5 |
| 0.0687 | 5 |
| 0.06875 | 5 |
| 0.0688 | 5 |
| 0.06885 | 5 |
| 0.0689 | 5 |
| 0.06895 | 5 |
| 0.069 | 5 |
| 0.06905 | 5 |
| 0.0691 | 5 |
| 0.06915 | 5 |
| 0.0692 | 5 |
| 0.06925 | 5 |
| 0.0693 | 5 |
| 0.06935 | 0 |
| 0.0694 | 0 |
| 0.06945 | 0 |
| 0.0695 | 0 |
| 0.06955 | 0 |
| 0.0696 | 0 |
| 0.06965 | 0 |
| 0.0697 | 5 |
| 0.06975 | 5 |
| 0.0698 | 5 |
| 0.06985 | 5 |
| 0.0699 | 5 |
| 0.06995 | 5 |
| 0.07 | 5 |
| 0.07005 | 5 |
| 0.0701 | 5 |
| 0.07015 | 5 |
| 0.0702 | 5 |
| 0.07025 | 5 |
| 0.0703 | 5 |
| 0.07035 | 5 |
| 0.0704 | 5 |
| 0.07045 | 5 |
| 0.0705 | 5 |
| 0.07055 | 5 |
| 0.0706 | 5 |
| 0.07065 | 0 |
| 0.0707 | 0 |
| 0.07075 | 0 |
| 0.0708 | 0 |
| 0.07085 | 0 |
| 0.0709 | 0 |
| 0.07095 | 0 |
| 0.071 | 0 |
| 0.07105 | 5 |
| 0.0711 | 5 |
| 0.07115 | 5 |
| 0.0712 | 5 |
| 0.07125 | 5 |
| 0.0713 | 5 |
| 0.07135 | 5 |
| 0.0714 | 5 |
| 0.07145 | 5 |
| 0.0715 | 5 |
| 0.07155 | 5 |
| 0.0716 | 5 |
| 0.07165 | 5 |
| 0.0717 | 5 |
| 0.07175 | 5 |
| 0.0718 | 5 |
| 0.07185 | 5 |
| 0.0719 | 5 |
| 0.07195 | 5 |
| 0.072 | 0 |
| 0.07205 | 0 |
| 0.0721 | 0 |
| 0.07215 | 0 |
| 0.0722 | 0 |
| 0.07225 | 0 |
| 0.0723 | 0 |
| 0.07235 | 0 |
| 0.0724 | 5 |
| 0.07245 | 5 |
| 0.0725 | 5 |
| 0.07255 | 5 |
| 0.0726 | 5 |
| 0.07265 | 5 |
| 0.0727 | 5 |
| 0.07275 | 5 |
| 0.0728 | 5 |
| 0.07285 | 5 |
| 0.0729 | 5 |
| 0.07295 | 5 |
| 0.073 | 5 |
| 0.07305 | 5 |
| 0.0731 | 5 |
| 0.07315 | 5 |
| 0.0732 | 5 |
| 0.07325 | 5 |
| 0.0733 | 5 |
| 0.07335 | 0 |
| 0.0734 | 0 |
| 0.07345 | 0 |
| 0.0735 | 0 |
| 0.07355 | 0 |
| 0.0736 | 0 |
| 0.07365 | 0 |
| 0.0737 | 0 |
| 0.07375 | 5 |
| 0.0738 | 5 |
| 0.07385 | 5 |
| 0.0739 | 5 |
| 0.07395 | 5 |
| 0.074 | 5 |
| 0.07405 | 5 |
| 0.0741 | 5 |
| 0.07415 | 5 |
| 0.0742 | 5 |
| 0.07425 | 5 |
| 0.0743 | 5 |
| 0.07435 | 5 |
| 0.0744 | 5 |
| 0.07445 | 5 |
| 0.0745 | 5 |
| 0.07455 | 5 |
| 0.0746 | 5 |
| 0.07465 | 5 |
| 0.0747 | 0 |
| 0.07475 | 0 |
| 0.0748 | 0 |
| 0.07485 | 0 |
| 0.0749 | 0 |
| 0.07495 | 0 |
| 0.075 | 0 |
| 0.07505 | 5 |
| 0.0751 | 5 |
| 0.07515 | 5 |
| 0.0752 | 5 |
| 0.07525 | 5 |
| 0.0753 | 5 |
| 0.07535 | 5 |
| 0.0754 | 5 |
| 0.07545 | 5 |
| 0.0755 | 5 |
| 0.07555 | 5 |
| 0.0756 | 5 |
| 0.07565 | 5 |
| 0.0757 | 5 |
| 0.07575 | 5 |
| 0.0758 | 5 |
| 0.07585 | 5 |
| 0.0759 | 5 |
| 0.07595 | 5 |
| 0.076 | 5 |
| 0.07605 | 0 |
| 0.0761 | 0 |
| 0.07615 | 0 |
| 0.0762 | 0 |
| 0.07625 | 0 |
| 0.0763 | 0 |
| 0.07635 | 0 |
| 0.0764 | 5 |
| 0.07645 | 5 |
| 0.0765 | 5 |
| 0.07655 | 5 |
| 0.0766 | 5 |
| 0.07665 | 5 |
| 0.0767 | 5 |
| 0.07675 | 5 |
| 0.0768 | 5 |
| 0.07685 | 5 |
| 0.0769 | 5 |
| 0.07695 | 5 |
| 0.077 | 5 |
| 0.07705 | 5 |
| 0.0771 | 5 |
| 0.07715 | 5 |
| 0.0772 | 5 |
| 0.07725 | 5 |
| 0.0773 | 5 |
| 0.07735 | 0 |
| 0.0774 | 0 |
| 0.07745 | 0 |
| 0.0775 | 0 |
| 0.07755 | 0 |
| 0.0776 | 0 |
| 0.07765 | 0 |
| 0.0777 | 0 |
| 0.07775 | 5 |
| 0.0778 | 5 |
| 0.07785 | 5 |
| 0.0779 | 5 |
| 0.07795 | 5 |
| 0.078 | 5 |
| 0.07805 | 5 |
| 0.0781 | 5 |
| 0.07815 | 5 |
| 0.0782 | 5 |
| 0.07825 | 5 |
| 0.0783 | 5 |
| 0.07835 | 5 |
| 0.0784 | 5 |
| 0.07845 | 5 |
| 0.0785 | 5 |
| 0.07855 | 5 |
| 0.0786 | 5 |
| 0.07865 | 5 |
| 0.0787 | 0 |
| 0.07875 | 0 |
| 0.0788 | 0 |
| 0.07885 | 0 |
| 0.0789 | 0 |
| 0.07895 | 0 |
| 0.079 | 0 |
| 0.07905 | 0 |
| 0.0791 | 5 |
| 0.07915 | 5 |
| 0.0792 | 5 |
| 0.07925 | 5 |
| 0.0793 | 5 |
| 0.07935 | 5 |
| 0.0794 | 5 |
| 0.07945 | 5 |
| 0.0795 | 5 |
| 0.07955 | 5 |
| 0.0796 | 5 |
| 0.07965 | 5 |
| 0.0797 | 5 |
| 0.07975 | 5 |
| 0.0798 | 5 |
| 0.07985 | 5 |
| 0.0799 | 5 |
| 0.07995 | 5 |
| 0.08 | 5 |
| 0.08005 | 0 |
| 0.0801 | 0 |
| 0.08015 | 0 |
| 0.0802 | 0 |
| 0.08025 | 0 |
| 0.0803 | 0 |
| 0.08035 | 0 |
| 0.0804 | 0 |
| 0.08045 | 5 |
| 0.0805 | 5 |
| 0.08055 | 5 |
| 0.0806 | 5 |
| 0.08065 | 5 |
| 0.0807 | 5 |
| 0.08075 | 5 |
| 0.0808 | 5 |
| 0.08085 | 5 |
| 0.0809 | 5 |
| 0.08095 | 5 |
| 0.081 | 5 |
| 0.08105 | 5 |
| 0.0811 | 5 |
| 0.08115 | 5 |
| 0.0812 | 5 |
| 0.08125 | 5 |
| 0.0813 | 5 |
| 0.08135 | 5 |
| 0.0814 | 0 |
| 0.08145 | 0 |
| 0.0815 | 0 |
| 0.08155 | 0 |
| 0.0816 | 0 |
| 0.08165 | 0 |
| 0.0817 | 0 |
| 0.08175 | 5 |
| 0.0818 | 5 |
| 0.08185 | 5 |
| 0.0819 | 5 |
| 0.08195 | 5 |
| 0.082 | 5 |
| 0.08205 | 5 |
| 0.0821 | 5 |
| 0.08215 | 5 |
| 0.0822 | 5 |
| 0.08225 | 5 |
| 0.0823 | 5 |
| 0.08235 | 5 |
| 0.0824 | 5 |
| 0.08245 | 5 |
| 0.0825 | 5 |
| 0.08255 | 5 |
| 0.0826 | 5 |
| 0.08265 | 5 |
| 0.0827 | 5 |
| 0.08275 | 0 |
| 0.0828 | 0 |
| 0.08285 | 0 |
| 0.0829 | 0 |
| 0.08295 | 0 |
| 0.083 | 0 |
| 0.08305 | 0 |
| 0.0831 | 5 |
| 0.08315 | 5 |
| 0.0832 | 5 |
| 0.08325 | 5 |
| 0.0833 | 5 |
| 0.08335 | 5 |
| 0.0834 | 5 |
| 0.08345 | 5 |
| 0.0835 | 5 |
| 0.08355 | 5 |
| 0.0836 | 5 |
| 0.08365 | 5 |
| 0.0837 | 5 |
| 0.08375 | 5 |
| 0.0838 | 5 |
| 0.08385 | 5 |
| 0.0839 | 5 |
| 0.08395 | 5 |
| 0.084 | 5 |
| 0.08405 | 0 |
| 0.0841 | 0 |
| 0.08415 | 0 |
| 0.0842 | 0 |
| 0.08425 | 0 |
| 0.0843 | 0 |
| 0.08435 | 0 |
| 0.0844 | 0 |
| 0.08445 | 5 |
| 0.0845 | 5 |
| 0.08455 | 5 |
| 0.0846 | 5 |
| 0.08465 | 5 |
| 0.0847 | 5 |
| 0.08475 | 5 |
| 0.0848 | 5 |
| 0.08485 | 5 |
| 0.0849 | 5 |
| 0.08495 | 5 |
| 0.085 | 5 |
| 0.08505 | 5 |
| 0.0851 | 5 |
| 0.08515 | 5 |
| 0.0852 | 5 |
| 0.08525 | 5 |
| 0.0853 | 5 |
| 0.08535 | 5 |
| 0.0854 | 0 |
| 0.08545 | 0 |
| 0.0855 | 0 |
| 0.08555 | 0 |
| 0.0856 | 0 |
| 0.08565 | 0 |
| 0.0857 | 0 |
| 0.08575 | 0 |
| 0.0858 | 5 |
| 0.08585 | 5 |
| 0.0859 | 5 |
| 0.08595 | 5 |
| 0.086 | 5 |
| 0.08605 | 5 |
| 0.0861 | 5 |
| 0.08615 | 5 |
| 0.0862 | 5 |
| 0.08625 | 5 |
| 0.0863 | 5 |
| 0.08635 | 5 |
| 0.0864 | 5 |
| 0.08645 | 5 |
| 0.0865 | 5 |
| 0.08655 | 5 |
| 0.0866 | 5 |
| 0.08665 | 5 |
| 0.0867 | 5 |
| 0.08675 | 0 |
| 0.0868 | 0 |
| 0.08685 | 0 |
| 0.0869 | 0 |
| 0.08695 | 0 |
| 0.087 | 0 |
| 0.08705 | 0 |
| 0.0871 | 5 |
| 0.08715 | 5 |
| 0.0872 | 5 |
| 0.08725 | 5 |
| 0.0873 | 5 |
| 0.08735 | 5 |
| 0.0874 | 5 |
| 0.08745 | 5 |
| 0.0875 | 5 |
| 0.08755 | 5 |
| 0.0876 | 5 |
| 0.08765 | 5 |
| 0.0877 | 5 |
| 0.08775 | 5 |
| 0.0878 | 5 |
| 0.08785 | 5 |
| 0.0879 | 5 |
| 0.08795 | 5 |
| 0.088 | 5 |
| 0.08805 | 5 |
| 0.0881 | 0 |
| 0.08815 | 0 |
| 0.0882 | 0 |
| 0.08825 | 0 |
| 0.0883 | 0 |
| 0.08835 | 0 |
| 0.0884 | 0 |
| 0.08845 | 5 |
| 0.0885 | 5 |
| 0.08855 | 5 |
| 0.0886 | 5 |
| 0.08865 | 5 |
| 0.0887 | 5 |
| 0.08875 | 5 |
| 0.0888 | 5 |
| 0.08885 | 5 |
| 0.0889 | 5 |
| 0.08895 | 5 |
| 0.089 | 5 |
| 0.08905 | 5 |
| 0.0891 | 5 |
| 0.08915 | 5 |
| 0.0892 | 5 |
| 0.08925 | 5 |
| 0.0893 | 5 |
| 0.08935 | 5 |
| 0.0894 | 5 |
| 0.08945 | 0 |
| 0.0895 | 0 |
| 0.08955 | 0 |
| 0.0896 | 0 |
| 0.08965 | 0 |
| 0.0897 | 0 |
| 0.08975 | 0 |
| 0.0898 | 5 |
| 0.08985 | 5 |
| 0.0899 | 5 |
| 0.08995 | 5 |
| 0.09 | 5 |
| 0.09005 | 5 |
| 0.0901 | 5 |
| 0.09015 | 5 |
| 0.0902 | 5 |
| 0.09025 | 5 |
| 0.0903 | 5 |
| 0.09035 | 5 |
| 0.0904 | 5 |
| 0.09045 | 5 |
| 0.0905 | 5 |
| 0.09055 | 5 |
| 0.0906 | 5 |
| 0.09065 | 5 |
| 0.0907 | 5 |
| 0.09075 | 0 |
| 0.0908 | 0 |
| 0.09085 | 0 |
| 0.0909 | 0 |
| 0.09095 | 0 |
| 0.091 | 0 |
| 0.09105 | 0 |
| 0.0911 | 0 |
| 0.09115 | 5 |
| 0.0912 | 5 |
| 0.09125 | 5 |
| 0.0913 | 5 |
| 0.09135 | 5 |
| 0.0914 | 5 |
| 0.09145 | 5 |
| 0.0915 | 5 |
| 0.09155 | 5 |
| 0.0916 | 5 |
| 0.09165 | 5 |
| 0.0917 | 5 |
| 0.09175 | 5 |
| 0.0918 | 5 |
| 0.09185 | 5 |
| 0.0919 | 5 |
| 0.09195 | 5 |
| 0.092 | 5 |
| 0.09205 | 5 |
| 0.0921 | 0 |
| 0.09215 | 0 |
| 0.0922 | 0 |
| 0.09225 | 0 |
| 0.0923 | 0 |
| 0.09235 | 0 |
| 0.0924 | 0 |
| 0.09245 | 0 |
| 0.0925 | 5 |
| 0.09255 | 5 |
| 0.0926 | 5 |
| 0.09265 | 5 |
| 0.0927 | 5 |
| 0.09275 | 5 |
| 0.0928 | 5 |
| 0.09285 | 5 |
| 0.0929 | 5 |
| 0.09295 | 5 |
| 0.093 | 5 |
| 0.09305 | 5 |
| 0.0931 | 5 |
| 0.09315 | 5 |
| 0.0932 | 5 |
| 0.09325 | 5 |
| 0.0933 | 5 |
| 0.09335 | 5 |
| 0.0934 | 5 |
| 0.09345 | 0 |
| 0.0935 | 0 |
| 0.09355 | 0 |
| 0.0936 | 0 |
| 0.09365 | 0 |
| 0.0937 | 0 |
| 0.09375 | 0 |
| 0.0938 | 5 |
| 0.09385 | 5 |
| 0.0939 | 5 |
| 0.09395 | 5 |
| 0.094 | 5 |
| 0.09405 | 5 |
| 0.0941 | 5 |
| 0.09415 | 5 |
| 0.0942 | 5 |
| 0.09425 | 5 |
| 0.0943 | 5 |
| 0.09435 | 5 |
| 0.0944 | 5 |
| 0.09445 | 5 |
| 0.0945 | 5 |
| 0.09455 | 5 |
| 0.0946 | 5 |
| 0.09465 | 5 |
| 0.0947 | 5 |
| 0.09475 | 5 |
| 0.0948 | 0 |
| 0.09485 | 0 |
| 0.0949 | 0 |
| 0.09495 | 0 |
| 0.095 | 0 |
| 0.09505 | 0 |
| 0.0951 | 0 |
| 0.09515 | 5 |
| 0.0952 | 5 |
| 0.09525 | 5 |
| 0.0953 | 5 |
| 0.09535 | 5 |
| 0.0954 | 5 |
| 0.09545 | 5 |
| 0.0955 | 5 |
| 0.09555 | 5 |
| 0.0956 | 5 |
| 0.09565 | 5 |
| 0.0957 | 5 |
| 0.09575 | 5 |
| 0.0958 | 5 |
| 0.09585 | 5 |
| 0.0959 | 5 |
| 0.09595 | 5 |
| 0.096 | 5 |
| 0.09605 | 5 |
| 0.0961 | 0 |
| 0.09615 | 0 |
| 0.0962 | 0 |
| 0.09625 | 0 |
| 0.0963 | 0 |
| 0.09635 | 0 |
| 0.0964 | 0 |
| 0.09645 | 0 |
| 0.0965 | 5 |
| 0.09655 | 5 |
| 0.0966 | 5 |
| 0.09665 | 5 |
| 0.0967 | 5 |
| 0.09675 | 5 |
| 0.0968 | 5 |
| 0.09685 | 5 |
| 0.0969 | 5 |
| 0.09695 | 5 |
| 0.097 | 5 |
| 0.09705 | 5 |
| 0.0971 | 5 |
| 0.09715 | 5 |
| 0.0972 | 5 |
| 0.09725 | 5 |
| 0.0973 | 5 |
| 0.09735 | 5 |
| 0.0974 | 5 |
| 0.09745 | 5 |
| 0.0975 | 5 |
| 0.09755 | 5 |
| 0.0976 | 5 |
| 0.09765 | 5 |
| 0.0977 | 5 |
| 0.09775 | 5 |
| 0.0978 | 5 |
| 0.09785 | 0 |
| 0.0979 | 0 |
| 0.09795 | 0 |
| 0.098 | 0 |
| 0.09805 | 0 |
| 0.0981 | 0 |
| 0.09815 | 0 |
| 0.0982 | 5 |
| 0.09825 | 5 |
| 0.0983 | 5 |
| 0.09835 | 5 |
| 0.0984 | 5 |
| 0.09845 | 5 |
| 0.0985 | 5 |
| 0.09855 | 5 |
| 0.0986 | 5 |
| 0.09865 | 5 |
| 0.0987 | 5 |
| 0.09875 | 5 |
| 0.0988 | 5 |
| 0.09885 | 5 |
| 0.0989 | 5 |
| 0.09895 | 5 |
| 0.099 | 5 |
| 0.09905 | 5 |
| 0.0991 | 5 |
| 0.09915 | 0 |
| 0.0992 | 0 |
| 0.09925 | 0 |
| 0.0993 | 0 |
| 0.09935 | 0 |
| 0.0994 | 0 |
| 0.09945 | 0 |
| 0.0995 | 0 |
| 0.09955 | 5 |
| 0.0996 | 5 |
| 0.09965 | 5 |
| 0.0997 | 5 |
| 0.09975 | 5 |
| 0.0998 | 5 |
| 0.09985 | 5 |
| 0.0999 | 5 |
| 0.09995 | 5 |